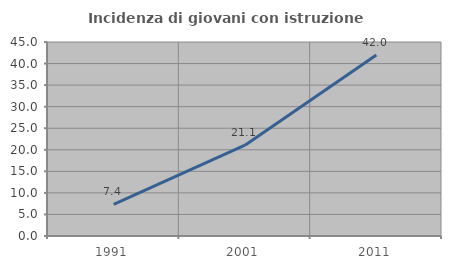
| Category | Incidenza di giovani con istruzione universitaria |
|---|---|
| 1991.0 | 7.353 |
| 2001.0 | 21.053 |
| 2011.0 | 42 |